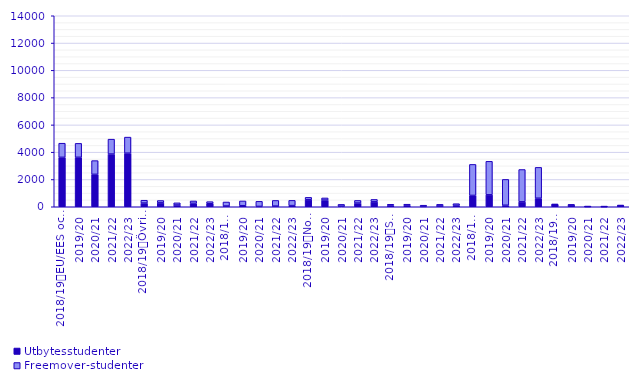
| Category | Utbytesstudenter | Freemover-studenter |
|---|---|---|
| 0 | 3622 | 1036 |
| 1 | 3624 | 1023 |
| 2 | 2375 | 1008 |
| 3 | 3861 | 1094 |
| 4 | 3928 | 1177 |
| 5 | 269 | 210 |
| 6 | 283 | 175 |
| 7 | 127 | 160 |
| 8 | 248 | 178 |
| 9 | 218 | 156 |
| 10 | 53 | 296 |
| 11 | 75 | 350 |
| 12 | 24 | 374 |
| 13 | 48 | 416 |
| 14 | 84 | 385 |
| 15 | 509 | 180 |
| 16 | 487 | 159 |
| 17 | 42 | 131 |
| 18 | 268 | 195 |
| 19 | 359 | 178 |
| 20 | 91 | 90 |
| 21 | 91 | 96 |
| 22 | 23 | 91 |
| 23 | 57 | 120 |
| 24 | 101 | 123 |
| 25 | 829 | 2275 |
| 26 | 874 | 2457 |
| 27 | 110 | 1895 |
| 28 | 359 | 2371 |
| 29 | 626 | 2261 |
| 30 | 170 | 13 |
| 31 | 134 | 9 |
| 32 | 15 | 8 |
| 33 | 12 | 6 |
| 34 | 91 | 9 |